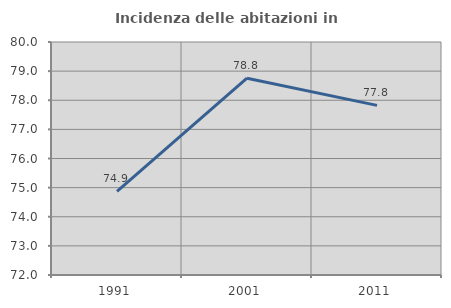
| Category | Incidenza delle abitazioni in proprietà  |
|---|---|
| 1991.0 | 74.869 |
| 2001.0 | 78.757 |
| 2011.0 | 77.823 |